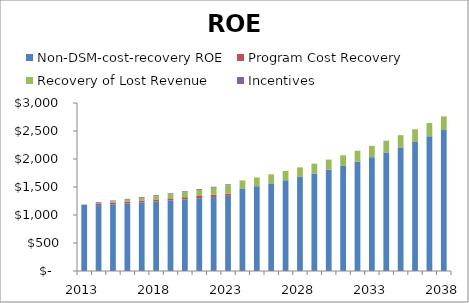
| Category | Non-DSM-cost-recovery ROE | Program Cost Recovery | Recovery of Lost Revenue | Incentives |
|---|---|---|---|---|
| 2013.0 | 1185657829.967 | 0 | 0 | 0 |
| 2014.0 | 1176178087.172 | 31790441 | 10444652.552 | 12521547.397 |
| 2015.0 | 1191457520.608 | 32735671.372 | 21613791.668 | 12875777.009 |
| 2016.0 | 1207516478.521 | 33709131.789 | 33581080.46 | 13247431.394 |
| 2017.0 | 1224367378.008 | 34711669.307 | 46428106.156 | 13637438.296 |
| 2018.0 | 1242018465.016 | 35744156.521 | 60245271.615 | 14046775.267 |
| 2019.0 | 1260472886.963 | 36807492.34 | 75132790.688 | 14476472.324 |
| 2020.0 | 1279727615.247 | 37902602.784 | 91201799.818 | 14927614.734 |
| 2021.0 | 1299772194.834 | 39030441.806 | 108575599.777 | 15401345.962 |
| 2022.0 | 1320587294.584 | 40191992.14 | 127391043.114 | 15898870.76 |
| 2023.0 | 1342143027.787 | 41388266.172 | 147800084.786 | 16421458.43 |
| 2024.0 | 1465409228.505 | 0 | 151936800.787 | 0 |
| 2025.0 | 1513844943.196 | 0 | 156322546.638 | 0 |
| 2026.0 | 1565382490.604 | 0 | 160973500.439 | 0 |
| 2027.0 | 1620228106.45 | 0 | 165906900.107 | 0 |
| 2028.0 | 1678601819.712 | 0 | 171141113.032 | 0 |
| 2029.0 | 1740738380.186 | 0 | 176695710.303 | 0 |
| 2030.0 | 1806888248.552 | 0 | 182591545.816 | 0 |
| 2031.0 | 1877318653.165 | 0 | 188850840.577 | 0 |
| 2032.0 | 1952314718.056 | 0 | 195497272.549 | 0 |
| 2033.0 | 2032180666.933 | 0 | 202556072.389 | 0 |
| 2034.0 | 2117241108.325 | 0 | 210054125.484 | 0 |
| 2035.0 | 2207842407.319 | 0 | 218020080.68 | 0 |
| 2036.0 | 2304354149.731 | 0 | 226484466.15 | 0 |
| 2037.0 | 2407170704.965 | 0 | 235479812.876 | 0 |
| 2038.0 | 2516712894.191 | 0 | 245040786.225 | 0 |